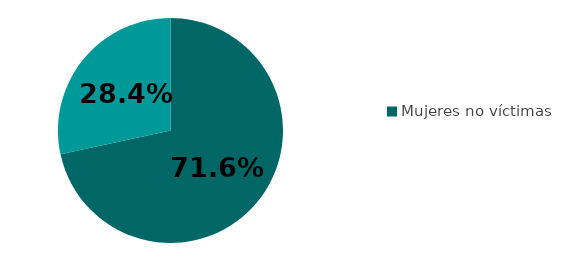
| Category | % sobre mujeres mujeres (16-74 años) que han trabajado alguna vez en su vida  |
|---|---|
| Mujeres no víctimas | 71.621 |
| Mujeres víctimas | 28.379 |